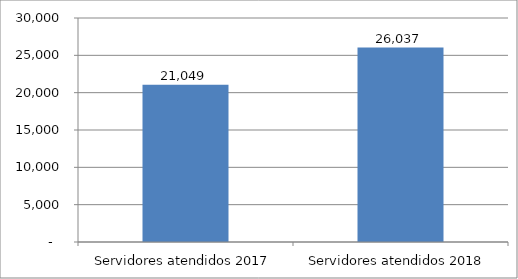
| Category | Series 0 |
|---|---|
| Servidores atendidos 2017 | 21049 |
| Servidores atendidos 2018 | 26037 |